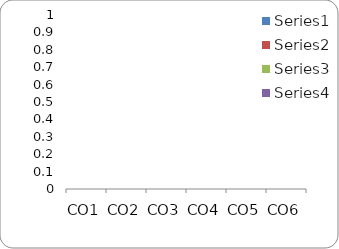
| Category | Series 0 | Series 1 | Series 2 | Series 3 |
|---|---|---|---|---|
| CO1 |  | 0 | 0 | 0 |
| CO2 |  | 0 | 0 | 0 |
| CO3 |  | 0 | 0 | 0 |
| CO4 |  | 0 | 0 | 0 |
| CO5 |  | 0 | 0 | 0 |
| CO6 |  | 0 | 0 | 0 |